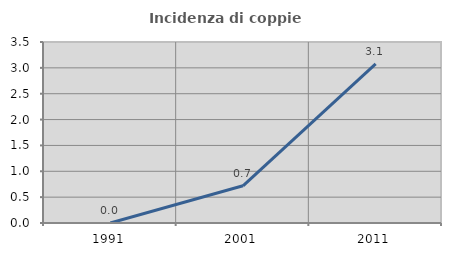
| Category | Incidenza di coppie miste |
|---|---|
| 1991.0 | 0 |
| 2001.0 | 0.719 |
| 2011.0 | 3.077 |